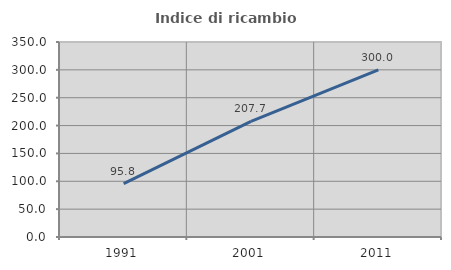
| Category | Indice di ricambio occupazionale  |
|---|---|
| 1991.0 | 95.833 |
| 2001.0 | 207.692 |
| 2011.0 | 300 |